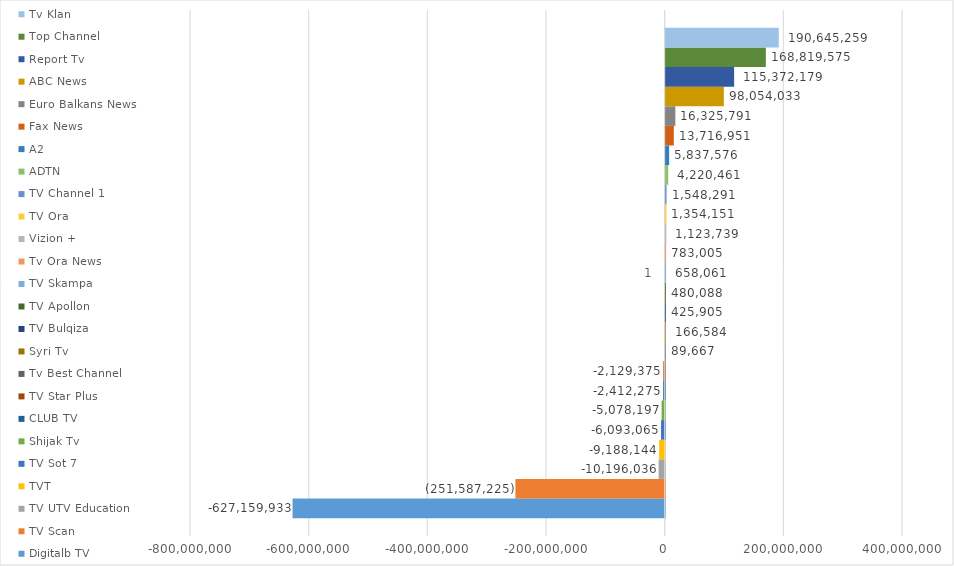
| Category | Digitalb TV | TV Scan | TV UTV Education | TVT | TV Sot 7 | Shijak Tv | CLUB TV | TV Star Plus | Tv Best Channel | Syri Tv | TV Bulqiza | TV Apollon | TV Skampa | Tv Ora News | Vizion + | TV Ora | TV Channel 1 | ADTN | A2 | Fax News | Euro Balkans News | ABC News | Report Tv | Top Channel | Tv Klan  |
|---|---|---|---|---|---|---|---|---|---|---|---|---|---|---|---|---|---|---|---|---|---|---|---|---|---|
| 0 | -627159933 | -251587225 | -10196036 | -9188144 | -6093065 | -5078197 | -2412275 | -2129375 | 89667 | 166584 | 425905 | 480088.2 | 658061 | 783005 | 1123739 | 1354151 | 1548291 | 4220461 | 5837576 | 13716951 | 16325791 | 98054033 | 115372179 | 168819575 | 190645259 |